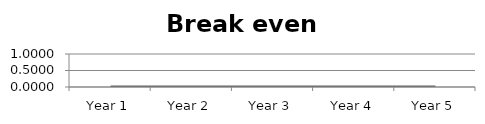
| Category | Break even number of EFTS |
|---|---|
| Year 1 | 0 |
| Year 2 | 0 |
| Year 3 | 0 |
| Year 4 | 0 |
| Year 5 | 0 |